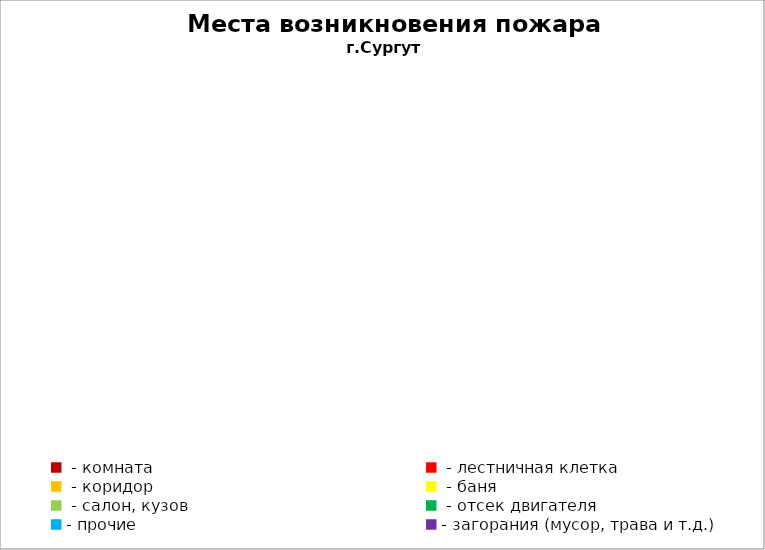
| Category | Места возникновения пожара |
|---|---|
|  - комната | 18 |
|  - лестничная клетка | 9 |
|  - коридор | 3 |
|  - баня | 10 |
|  - салон, кузов | 3 |
|  - отсек двигателя | 6 |
| - прочие | 18 |
| - загорания (мусор, трава и т.д.)  | 28 |